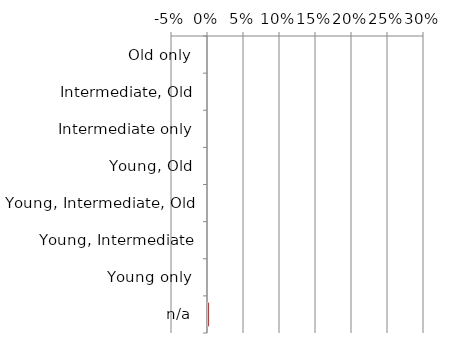
| Category | Not determinable |
|---|---|
| n/a | 0.002 |
| Young only | 0 |
| Young, Intermediate | 0 |
| Young, Intermediate, Old | 0 |
| Young, Old | 0 |
| Intermediate only | 0 |
| Intermediate, Old | 0 |
| Old only | 0 |